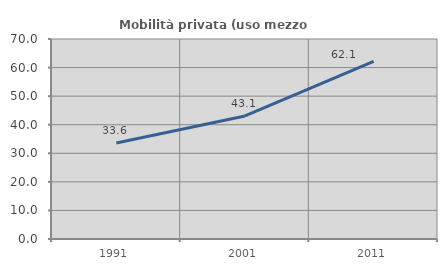
| Category | Mobilità privata (uso mezzo privato) |
|---|---|
| 1991.0 | 33.598 |
| 2001.0 | 43.072 |
| 2011.0 | 62.132 |